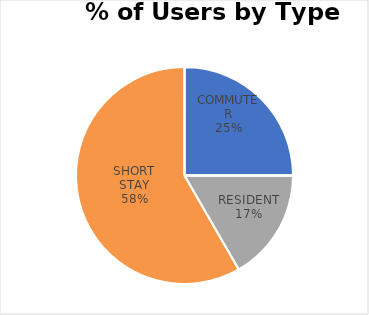
| Category | KINGS MEAD |
|---|---|
| COMMUTER | 3 |
| ILLEGAL | 0 |
| LONG STAY | 0 |
| RESIDENT | 2 |
| SHORT STAY | 7 |
| DISABLED | 0 |
| OTHER | 0 |